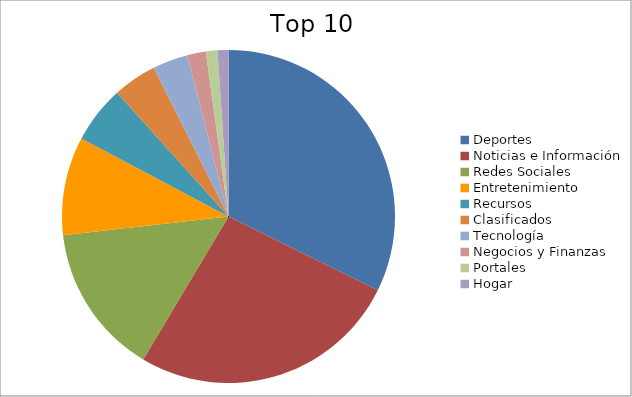
| Category | Series 0 |
|---|---|
| Deportes | 30.57 |
| Noticias e Información | 24.85 |
| Redes Sociales | 13.86 |
| Entretenimiento | 9.04 |
| Recursos | 5.28 |
| Clasificados | 4.02 |
| Tecnología | 3.25 |
| Negocios y Finanzas | 1.71 |
| Portales | 1.06 |
| Hogar | 1 |